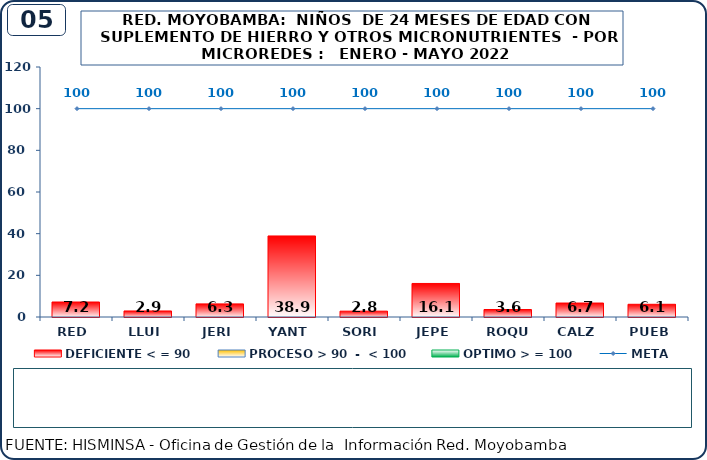
| Category | DEFICIENTE < = 90 | PROCESO > 90  -  < 100 | OPTIMO > = 100 |
|---|---|---|---|
| RED | 7.2 | 0 | 0 |
| LLUI | 2.9 | 0 | 0 |
| JERI | 6.3 | 0 | 0 |
| YANT | 38.9 | 0 | 0 |
| SORI | 2.8 | 0 | 0 |
| JEPE | 16.1 | 0 | 0 |
| ROQU | 3.6 | 0 | 0 |
| CALZ | 6.7 | 0 | 0 |
| PUEB | 6.1 | 0 | 0 |